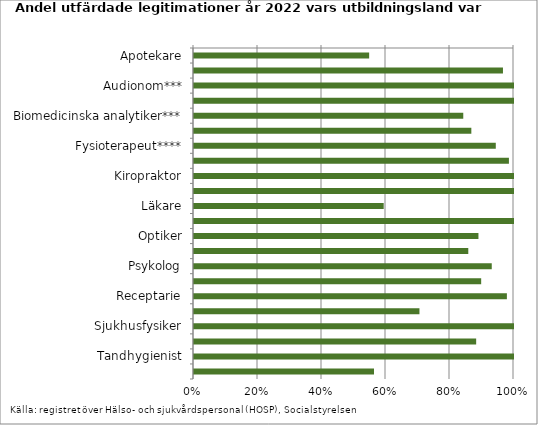
| Category | Series 0 |
|---|---|
| Apotekare | 0.547 |
| Arbetsterapeut | 0.966 |
| Audionom*** | 1 |
| Barnmorska | 1 |
| Biomedicinska analytiker*** | 0.841 |
| Dietist*** | 0.867 |
| Fysioterapeut**** | 0.943 |
| Hälso- och sjukvårdskurator*** | 0.984 |
| Kiropraktor | 1 |
| Logoped | 1 |
| Läkare | 0.593 |
| Naprapat | 1 |
| Optiker | 0.889 |
| Ortopedingenjör*** | 0.857 |
| Psykolog | 0.93 |
| Psykoterapeut | 0.897 |
| Receptarie | 0.978 |
| Röntgensjuksköterska*** | 0.705 |
| Sjukhusfysiker | 1 |
| Sjuksköterska | 0.882 |
| Tandhygienist | 1 |
| Tandläkare | 0.562 |